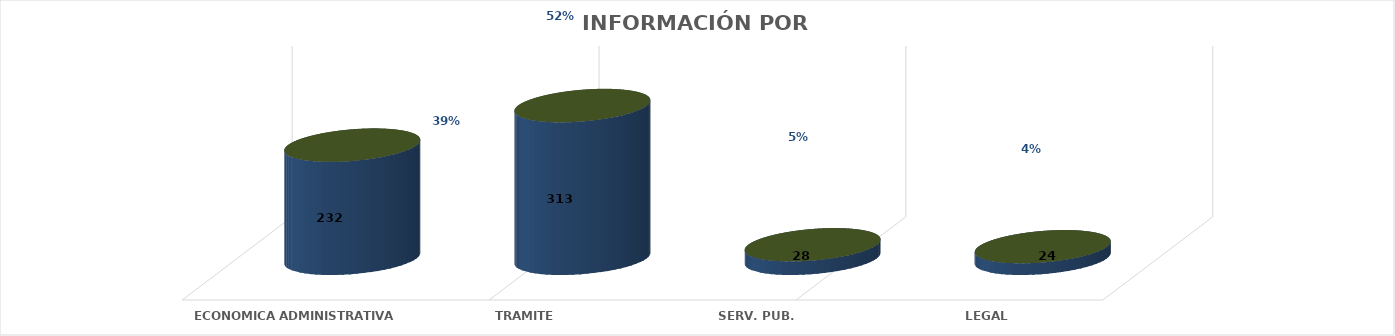
| Category | Series 0 | Series 1 | Series 2 | Series 3 | Series 4 |
|---|---|---|---|---|---|
| ECONOMICA ADMINISTRATIVA |  |  |  | 232 | 0.389 |
| TRAMITE |  |  |  | 313 | 0.524 |
| SERV. PUB. |  |  |  | 28 | 0.047 |
| LEGAL |  |  |  | 24 | 0.04 |